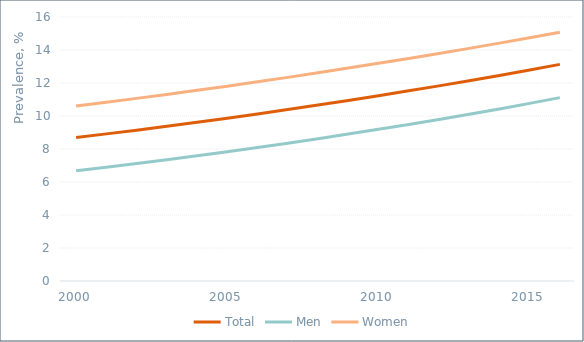
| Category | Total | Men | Women |
|---|---|---|---|
| 2000.0 | 8.7 | 6.681 | 10.607 |
| 2001.0 | 8.917 | 6.896 | 10.835 |
| 2002.0 | 9.138 | 7.119 | 11.068 |
| 2003.0 | 9.373 | 7.35 | 11.308 |
| 2004.0 | 9.619 | 7.588 | 11.554 |
| 2005.0 | 9.863 | 7.834 | 11.808 |
| 2006.0 | 10.118 | 8.089 | 12.071 |
| 2007.0 | 10.388 | 8.352 | 12.341 |
| 2008.0 | 10.663 | 8.624 | 12.62 |
| 2009.0 | 10.94 | 8.905 | 12.904 |
| 2010.0 | 11.232 | 9.193 | 13.194 |
| 2011.0 | 11.524 | 9.488 | 13.489 |
| 2012.0 | 11.826 | 9.792 | 13.791 |
| 2013.0 | 12.131 | 10.105 | 14.099 |
| 2014.0 | 12.45 | 10.43 | 14.416 |
| 2015.0 | 12.79 | 10.766 | 14.742 |
| 2016.0 | 13.128 | 11.114 | 15.076 |